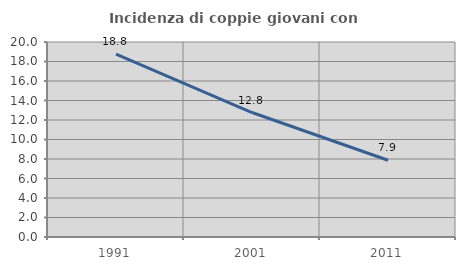
| Category | Incidenza di coppie giovani con figli |
|---|---|
| 1991.0 | 18.758 |
| 2001.0 | 12.767 |
| 2011.0 | 7.872 |